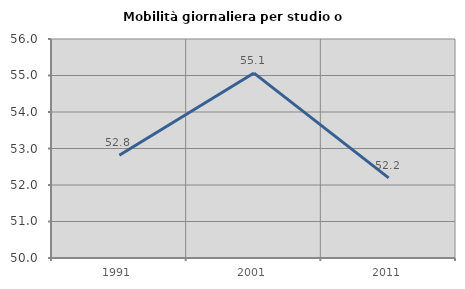
| Category | Mobilità giornaliera per studio o lavoro |
|---|---|
| 1991.0 | 52.814 |
| 2001.0 | 55.066 |
| 2011.0 | 52.195 |